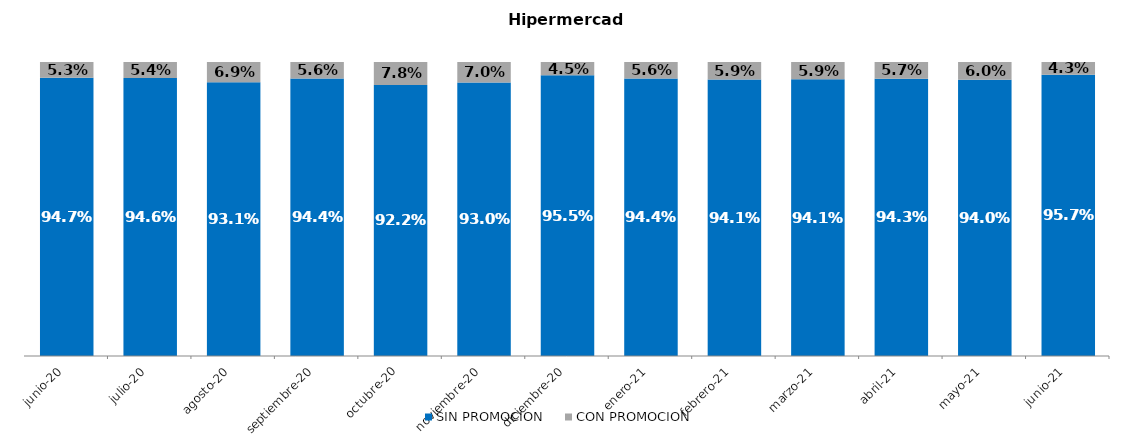
| Category | SIN PROMOCION   | CON PROMOCION   |
|---|---|---|
| 2020-06-01 | 0.947 | 0.053 |
| 2020-07-01 | 0.946 | 0.054 |
| 2020-08-01 | 0.931 | 0.069 |
| 2020-09-01 | 0.944 | 0.056 |
| 2020-10-01 | 0.922 | 0.078 |
| 2020-11-01 | 0.93 | 0.07 |
| 2020-12-01 | 0.955 | 0.045 |
| 2021-01-01 | 0.944 | 0.056 |
| 2021-02-01 | 0.941 | 0.059 |
| 2021-03-01 | 0.941 | 0.059 |
| 2021-04-01 | 0.943 | 0.057 |
| 2021-05-01 | 0.94 | 0.06 |
| 2021-06-01 | 0.957 | 0.043 |